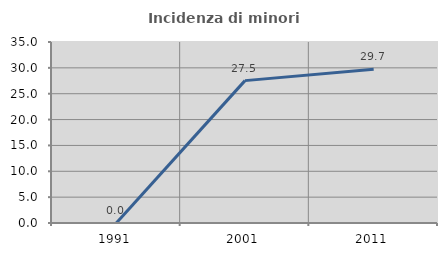
| Category | Incidenza di minori stranieri |
|---|---|
| 1991.0 | 0 |
| 2001.0 | 27.53 |
| 2011.0 | 29.711 |